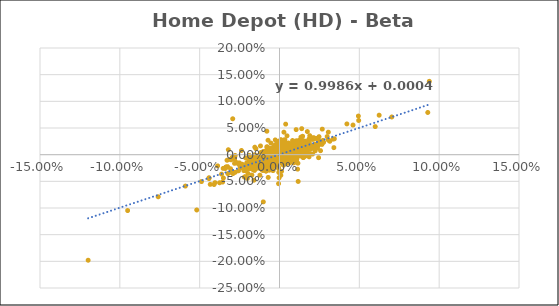
| Category | Series 0 |
|---|---|
| 0.002923183435833865 | 0.017 |
| 0.0002825850883885206 | -0.002 |
| -0.0009726252406339064 | 0.007 |
| -0.0013411865461215866 | 0.002 |
| -0.0007281258848751415 | 0.01 |
| 0.002449095251588762 | 0.002 |
| 0.0004926605689827834 | 0.004 |
| -0.0021835911800677232 | 0.002 |
| 0.0018890363083294837 | 0.013 |
| 0.001647266869345021 | 0.004 |
| -0.002414436638168982 | 0 |
| -0.0003636481179190021 | 0.012 |
| -0.01447441815345063 | -0.009 |
| 0.0012755258980974293 | 0.006 |
| 0.01004374682548792 | -0.004 |
| -0.0004988158193557357 | -0.027 |
| 0.0014201029777529683 | 0.014 |
| -0.015436913265616137 | -0.017 |
| -0.0018353833934839914 | -0.015 |
| 0.0011626229102676966 | 0.012 |
| 0.009940824503679613 | 0.005 |
| -0.003453604674394928 | -0.005 |
| -0.002074434133647607 | -0.006 |
| 0.0016728373042720346 | 0.009 |
| 0.00048709604797259054 | 0.012 |
| 0.0008427977612674997 | -0.004 |
| 0.004615133058087695 | 0.001 |
| 0.005721051924853171 | -0.001 |
| 0.0019824813383773066 | 0.006 |
| -0.007550826754961659 | 0.014 |
| 0.003128750737433128 | 0.024 |
| -0.00017845989113951521 | 0.009 |
| -0.001488783416494277 | 0.011 |
| 0.01083922760346634 | -0.008 |
| 0.003363999180100441 | 0.01 |
| 0.0007570659488558285 | 0.001 |
| -0.0011007176679195263 | -0.004 |
| 0.0018472363580994688 | -0.006 |
| 0.0014558660603223306 | -0.004 |
| 0.0011102812845715793 | -0.001 |
| 0.0006343127281429606 | 0.006 |
| -0.003045960514145296 | 0.003 |
| 0.0006478445173156988 | 0.005 |
| -0.002222026840165925 | 0.007 |
| 7.209632068461147e-05 | 0.001 |
| 0.004085163646849521 | -0.002 |
| 0.0012046078243665992 | 0.009 |
| 0.0037050907149631662 | 0.007 |
| 0.0038739997459671383 | 0.003 |
| 0.002158853672423522 | 0.007 |
| 0.0012467548864110167 | 0.001 |
| 0.005646756562926125 | 0.005 |
| -0.0010736382622734686 | -0.002 |
| -0.001804395664743219 | -0.001 |
| 0.002322446782173193 | -0.003 |
| 0.001803468933287311 | 0.001 |
| -0.0016867300136190755 | -0.004 |
| 0.0008781111202582625 | -0.001 |
| 0.0017507647356032052 | -0.002 |
| 0.0006724949562879612 | -0.005 |
| 0.0007423730932734074 | 0.001 |
| 0.0003279635804251946 | -0.001 |
| 0.005116896296007312 | 0.001 |
| -0.0039724915637947555 | 0.008 |
| 0.0016179463387628878 | 0.008 |
| -0.004663057143858063 | 0 |
| 0.0012709461705413538 | 0.01 |
| 0.008072957350414134 | -0.002 |
| -0.0031924744388955872 | -0.012 |
| 0.0009444852555358096 | 0.003 |
| 0.001592072256781707 | -0.002 |
| 0.00018996960486306058 | -0.016 |
| 0.0030970792875555375 | 0.01 |
| 0.0012713305304810074 | -0.001 |
| -0.00018910668318461443 | -0.003 |
| 0.0014436587098169973 | 0.002 |
| -0.003761977813581785 | -0.005 |
| -0.0008976174447306029 | 0.005 |
| 0.0009836192541532451 | 0.008 |
| -0.002309620711533511 | 0.016 |
| -0.005525675974360822 | -0.015 |
| 0.008196146017733552 | 0.012 |
| -0.0026260422951377427 | 0.001 |
| 0.001275762452255913 | 0.016 |
| 0.006541086075890767 | 0.014 |
| -0.0007502799121211767 | -0.005 |
| 0.002056155374497548 | 0.002 |
| -0.0003842577293442506 | 0.011 |
| 0.00984846737551015 | 0.014 |
| -0.00036923685973555553 | 0.009 |
| 0.008190946928299692 | 0.014 |
| -0.00202449028924534 | 0.003 |
| -0.0010521455442770167 | 0.025 |
| -0.003739429575970621 | -0.011 |
| -0.00011408709408766704 | -0.011 |
| 0.0029323728639507607 | 0.007 |
| 0.005506298872194781 | 0.008 |
| 0.0032019611540636816 | -0.006 |
| 0.0015488780033008354 | -0.002 |
| -0.0004729534441145766 | 0.007 |
| -0.004070826370242253 | -0.005 |
| 0.008974325134520456 | 0.002 |
| 0.005362862086620401 | 0.012 |
| -0.003230291135099761 | 0.007 |
| -0.0008279040973793172 | 0.007 |
| 0.0019856303069889503 | 0.004 |
| -0.0004581739347455649 | 0 |
| -0.0010583824636460903 | 0.012 |
| 0.00079089722066783 | -0.001 |
| 0.0018340279279212002 | -0.002 |
| -0.005183178668968558 | -0.001 |
| 0.008303380074131894 | -0.008 |
| 0.006398818907860759 | 0.005 |
| 0.004028661363921104 | 0.008 |
| 0.007033799683552555 | 0.01 |
| 0.0016623225124401397 | -0.002 |
| 0.0013029031448006378 | 0.006 |
| -0.0011122055472160275 | -0.007 |
| 0.007033618001404562 | 0.015 |
| 0.006749627831013516 | 0.009 |
| -0.0035244630756861017 | -0.001 |
| 0.009415002053003496 | 0.018 |
| -0.001616379310344751 | -0.007 |
| 0.004385228178396927 | 0.015 |
| 0.008066754439027823 | 0.016 |
| 0.002174396481431362 | 0.002 |
| -0.0005600307136341964 | 0.006 |
| 0.0006026346765155566 | -0.004 |
| 0.011841155234656897 | 0.009 |
| -0.006731944014173874 | -0.011 |
| -0.010898781509218525 | -0.015 |
| 0.0004889403811609849 | -0.005 |
| -0.0006480605989779287 | -0.005 |
| -0.021208513171602883 | -0.03 |
| -0.040979244278871785 | -0.056 |
| 0.017440938639606607 | 0.043 |
| -0.0050015954644285765 | 0.001 |
| -0.037536451302551344 | -0.053 |
| 0.014936071290197583 | 0.016 |
| 0.013914603653299107 | 0 |
| 0.0026129518072288693 | -0.002 |
| 0.013402479965752168 | 0.005 |
| 0.0120690869070601 | 0.003 |
| 0.0003734622144111466 | 0.009 |
| -0.005841403693699454 | -0.001 |
| -0.00549652831466807 | -0.02 |
| 0.0009735944886408721 | 0.013 |
| 0.016028343614550522 | 0.016 |
| 0.011756997779638123 | 0.001 |
| -0.012706864297021059 | -0.018 |
| -0.011095806550352139 | -0.015 |
| -0.013324342350110263 | -0.014 |
| 0.005071573420174946 | -0.007 |
| 0.011032048304691067 | 0.018 |
| 0.0026387939462098053 | -0.001 |
| -0.00048384968403136774 | -0.011 |
| 0.00446310693853591 | -0.004 |
| 0.017378795678667736 | 0.024 |
| -0.001273967637633433 | -0.013 |
| -0.00636359063175973 | -0.008 |
| -0.005724493818052956 | -0.005 |
| -0.0007819660444884358 | 0.004 |
| 0.0017034720983646334 | 0.005 |
| -0.014204163502312905 | -0.01 |
| 0.001481798210046792 | 0.006 |
| -0.001843986249236318 | -0.001 |
| -0.02516289137256489 | -0.015 |
| -0.020966906104724736 | -0.02 |
| 0.0271572407717926 | 0.027 |
| -0.017276334844182117 | -0.01 |
| -0.0029166124426820428 | 0 |
| 0.01376967370441462 | 0.02 |
| -0.02233733580221664 | -0.03 |
| 0.01261483879963432 | 0.005 |
| 0.011566486259060316 | 0.021 |
| 0.00686280811739759 | 0.01 |
| -0.02192020549488527 | -0.026 |
| 0.003336571356168383 | -0.011 |
| 0.01672687474169199 | 0.006 |
| -0.005525298565605352 | -0.004 |
| 0.008250731400845313 | 0.003 |
| -0.0028866474724003055 | -0.003 |
| 0.008109023830139561 | 0.009 |
| 0.01066157798822931 | 0.003 |
| 0.0008313657676830566 | 0.028 |
| -0.005726120857699746 | -0.015 |
| -0.008536535555283331 | 0 |
| 5.617682967939963e-05 | 0.004 |
| -0.01338056915166519 | -0.008 |
| 0.0018371189116968 | 0.006 |
| 0.01043418958854292 | 0.047 |
| 0.0011136358523251566 | 0.004 |
| -0.008187541902161422 | -0.009 |
| 0.0025490455240648746 | -0.001 |
| -0.007205815880669042 | 0.007 |
| -0.0022536964035709817 | -0.015 |
| 0.012811201149927953 | 0.01 |
| 0.003457960066380883 | -0.008 |
| -0.0002656559269333947 | 0.008 |
| 0.009682176113057217 | 0.007 |
| 0.009370632999603501 | 0.004 |
| 0.0017076314600799058 | 0.017 |
| 0.0008835217690965624 | 0.004 |
| -0.006842165025108815 | -0.016 |
| 0.004060558004020054 | -0.009 |
| -0.000855843612027285 | -0.006 |
| -0.002632227136203147 | 0.011 |
| 0.007386738519040259 | 0.013 |
| -0.0031357367883761977 | -0.015 |
| 0.003248373977771557 | -0.001 |
| -0.002023202806873625 | 0.003 |
| -0.002357245505469785 | -0.002 |
| -0.011564198388288038 | -0.01 |
| 0.01269582803565994 | 0.017 |
| -0.006879563584568427 | -0.003 |
| 0.01084919435028664 | 0.004 |
| 0.0044795986279628774 | 0.021 |
| 0.0007026178887243884 | 0.003 |
| 0.00856737485448189 | 0.009 |
| -0.0007141955380813858 | 0.013 |
| 0.0031259362467830343 | 0.011 |
| 0.0010687182218256375 | 0.007 |
| 0.0017433501078361058 | 0.008 |
| -0.004026050917702695 | -0.005 |
| 0.002471510972283708 | -0.003 |
| -0.0010170746345898873 | 0.004 |
| -0.0021261593144484836 | 0.001 |
| -0.004023433979269853 | -0.007 |
| 0.0017121614137458607 | -0.001 |
| -0.006345489498865264 | 0.006 |
| 0.0018619806819504259 | -0.014 |
| -0.013724735741665661 | -0.005 |
| 0.0022045806696182613 | 0 |
| -0.008604290761129008 | -0.007 |
| 0.006178624478169192 | 0.001 |
| 0.0007583817752760957 | -0.001 |
| 0.0030680150237090142 | -0.006 |
| -0.00494735413740377 | -0.002 |
| 0.00862075320099387 | 0.004 |
| 0.008481296202235589 | 0 |
| 0.008823039183714743 | 0.008 |
| 0.0034732074550045677 | 0.008 |
| -0.007094178621538827 | -0.003 |
| 0.008749035695488905 | 0.005 |
| 0.0010792305300737493 | 0.004 |
| -0.001028090429120665 | 0.001 |
| 0.00397365665748306 | 0.011 |
| 0.0021604883344306103 | -0.001 |
| -0.003952948196134454 | 0.008 |
| -0.0009484790461010695 | -0.001 |
| 0.00183808439484201 | -0.001 |
| 0.004780938945058377 | -0.001 |
| 0.009101545880016992 | -0.005 |
| -0.003032251490652005 | -0.008 |
| -0.006562253298748155 | -0.011 |
| -0.005754180827438504 | 0.001 |
| 0.00488474987511589 | 0.001 |
| -0.0010403758135703045 | -0.006 |
| 0.004926493587738445 | -0.003 |
| 0.0046441380578801095 | 0 |
| 0.0035382963367192044 | 0 |
| 0.002824165029469361 | 0.007 |
| -0.00026237996116773576 | 0.005 |
| -0.001441718864821362 | 0 |
| -0.0071138709971333425 | -0.009 |
| -0.004005957759204981 | -0.011 |
| 0.00638924424064391 | -0.005 |
| -0.00760221974957398 | 0.005 |
| 0.007919471183698512 | 0.007 |
| 0.0033231362802699227 | 0.001 |
| 0.002427959426412052 | 0.012 |
| 0.0020685672284348477 | 0.012 |
| -0.0003981892866123937 | -0.006 |
| -0.001691231454109654 | 0.006 |
| 0.0061988533346399866 | 0.006 |
| 0.007670392285776817 | 0.003 |
| 0.0002692682118519141 | 0 |
| 0.005701427427593275 | 0.004 |
| -0.004430275493816138 | -0.012 |
| 0.00013443037712890238 | 0.008 |
| -0.001654305329620409 | 0.021 |
| -0.002803170482476691 | -0.005 |
| -0.0036522883057535926 | 0.009 |
| -0.0022133041469051262 | 0.002 |
| 0.001897843770893859 | 0.022 |
| 0.0037398379635260603 | 0.015 |
| 0.00035666178420923345 | -0.009 |
| 0.005282250806529776 | -0.012 |
| 0.00027546501938591206 | -0.002 |
| -0.005569745746958565 | -0.003 |
| 0.005369011354195541 | 0.013 |
| 0.00125330973621951 | 0.003 |
| 0.007840574975498171 | -0.003 |
| -0.00036850635502849727 | 0.006 |
| -0.0035157543341060027 | -0.021 |
| -0.0013050760951849316 | -0.003 |
| -0.00328924803468289 | 0 |
| 0.0027632769780832067 | -0.003 |
| -6.863417982172493e-06 | 0.001 |
| 0.0036410682297065566 | 0.002 |
| -0.00039663679353352244 | -0.014 |
| 0.0007114930065028613 | -0.005 |
| -0.008169515742554312 | -0.024 |
| -0.005527965508803745 | -0.012 |
| -0.00039506925841348295 | 0.01 |
| -0.0014179577940874877 | -0.013 |
| -0.032864175757028824 | -0.01 |
| -0.020573073719881707 | -0.02 |
| 0.014206284338267983 | 0.014 |
| -0.005905035180855278 | -0.007 |
| 0.021495643069809 | 0.013 |
| -0.0002526762327753618 | -0.043 |
| -0.014391946490294405 | -0.026 |
| -0.00036116990154511086 | -0.003 |
| -0.0042994746692295305 | -0.006 |
| -0.00551185102399232 | -0.001 |
| -0.030864490329077787 | -0.009 |
| 0.018625051767629408 | 0.012 |
| -0.01732721755489608 | -0.038 |
| -0.006559621467715271 | 0.006 |
| 0.015666824420255576 | 0.018 |
| 0.010851291456518197 | -0.002 |
| 0.0105577968389301 | 0.026 |
| -0.006316665267828814 | -0.003 |
| 0.005600317290107348 | 0.013 |
| 0.006259335137365651 | -0.001 |
| 0.02120887695294771 | 0.029 |
| -0.0025089822274502183 | 0.004 |
| -0.009198989607493102 | -0.011 |
| -0.019701475363267495 | -0.035 |
| -0.001481905348797996 | -0.002 |
| -0.007567464311691308 | 0.005 |
| 0.010593800664796094 | -0.014 |
| 0.0022232803457622463 | -0.002 |
| -0.016643094431470606 | -0.019 |
| -0.018151208036480848 | -0.026 |
| 0.00304327583661701 | 0.001 |
| -0.006554890129173208 | -0.003 |
| 0.015532409517731827 | 0.006 |
| 0.003261703042884756 | 0.02 |
| 0.02297393528374414 | 0.03 |
| -0.0021976900564546487 | -0.01 |
| 0.00818552393197347 | 0.027 |
| 0.010941355061463431 | 0.008 |
| -0.03236488351007216 | -0.035 |
| -0.0015221883958135285 | 0.004 |
| -0.02332016543333515 | -0.018 |
| 0.001762194844060927 | -0.006 |
| -0.00035636837875119287 | 0.003 |
| 0.005419488922094429 | 0.012 |
| -0.00019991927787654795 | -0.002 |
| -0.019086676677205427 | -0.009 |
| -0.020773476413007863 | -0.025 |
| 8.641209140813899e-05 | 0.012 |
| -0.015395733182517968 | -0.015 |
| -0.015772090500047797 | -0.02 |
| -0.020588306814405377 | -0.022 |
| -0.02711224768478282 | -0.015 |
| 0.049593807154098 | 0.064 |
| 0.008562629168861635 | 0.012 |
| -0.0012415472330372657 | -0.001 |
| 0.008492440882795549 | 0.009 |
| 0.0012685242435728217 | 0.003 |
| -0.02475667621502542 | -0.022 |
| 0.0343356931888279 | 0.03 |
| 0.00701043468644591 | 0.02 |
| 0.009695296290921585 | 0.005 |
| 0.0040980263439003295 | 0.01 |
| 0.004518445159692908 | -0.004 |
| -0.00014634296629478794 | 0.002 |
| -0.005257562801876614 | -0.003 |
| 0.010721711756711327 | -0.013 |
| 0.002221966823736654 | 0.003 |
| 0.007591452926111408 | -0.012 |
| 0.013183052853609212 | 0.027 |
| -0.014157284018107563 | -0.014 |
| 0.0022028941471379238 | -0.001 |
| 0.001375677416909804 | 0.002 |
| 0.0084887201825663 | 0.018 |
| -0.0078468605052614 | -0.003 |
| -0.001456209694195909 | -0.001 |
| 0.015549242424242493 | 0.014 |
| 0.008597377892989533 | 0.007 |
| 0.000898635405495396 | 0.005 |
| 0.006776204217207926 | 0.011 |
| 0.004708481505539597 | 0 |
| -0.002224495014062744 | -0.009 |
| -0.009357119061652264 | -0.004 |
| 0.0006762624489569102 | 0.003 |
| 0.0007090417596054 | -0.009 |
| 0.012890250202966858 | 0.014 |
| 0.003023976857468691 | 0.016 |
| -0.0026516238471793185 | -0.004 |
| 0.010878709851296353 | 0.025 |
| 0.0014987750396311394 | 0 |
| 0.0017771318387196366 | -0.002 |
| -0.003526412180845262 | 0 |
| 0.006411088047050706 | 0.003 |
| 0.0012317960947767492 | -0.013 |
| -0.0007903837831845228 | -0.009 |
| -0.0005440423780378456 | -0.025 |
| -0.0028255466662847617 | 0.008 |
| 0.0068953381050032014 | 0 |
| -0.0038806002090102654 | -0.007 |
| -0.0011314768996100177 | 0.001 |
| -0.0065241159285216455 | 0.002 |
| -0.008125710368218741 | -0.011 |
| -0.0021317385309919112 | -0.007 |
| 0.014666049353461608 | 0.007 |
| 0.0029533287823806376 | 0.009 |
| 0.006949618845646821 | -0.008 |
| -0.0008680432029370966 | 0.003 |
| 0.004984902865607044 | 0.003 |
| 0.0037059607153993035 | 0.007 |
| -0.0001306063665308388 | 0.004 |
| -0.0029443226469249018 | 0.011 |
| 0.010852515552911779 | 0.021 |
| -0.018974527826038257 | -0.006 |
| -0.0008390729493592541 | 0.005 |
| 0.007182778484540853 | -0.002 |
| -0.004644380264399728 | 0 |
| 0.0035895443381801506 | 0.004 |
| 0.006734293751598397 | 0.01 |
| 0.01156858594411525 | 0.02 |
| 1.7438676892522764e-05 | -0.007 |
| 0.0021484075277968806 | 0.022 |
| 0.0020846384074615365 | 0.009 |
| 0.004636398681665099 | 0.008 |
| 0.0010474498226595852 | 0.007 |
| -0.0060674708281390766 | -0.013 |
| 0.0034778681120144483 | -0.007 |
| 3.808587325715429e-05 | 0.01 |
| 0.006609378462220095 | 0.012 |
| -0.0006294261903205811 | 0.005 |
| 0.000509364739569973 | -0.002 |
| -0.002273774879087531 | 0.01 |
| 0.0015790653174507785 | -0.004 |
| 0.001012037741434657 | -0.004 |
| 0.008841219132246891 | 0.006 |
| -0.0021917864252406494 | 0.003 |
| -0.00036894696387390624 | -0.001 |
| 0.004685305365033532 | -0.014 |
| 0.0010714723049920494 | -0.007 |
| 0.0009514004274504551 | 0.008 |
| -0.007502130129708795 | -0.024 |
| -0.0021239991380873624 | 0.011 |
| 0.00963832295922562 | -0.002 |
| -0.004471014787957861 | -0.005 |
| -0.016511677868827124 | -0.024 |
| -0.0016053813214057522 | 0.002 |
| -0.0030214418181440106 | -0.003 |
| 0.0037203210344445292 | 0 |
| -0.024130630943291487 | -0.022 |
| 0.008016017810211773 | 0.007 |
| 0.00583895766667486 | 0.001 |
| 0.008895249319527565 | 0.003 |
| -0.005837319908772343 | 0.001 |
| -0.006749360908960611 | -0.008 |
| 0.008495790833841 | 0.003 |
| -0.002824365652362215 | -0.013 |
| -0.011914139769699683 | 0.016 |
| 0.001353534780883292 | 0.008 |
| -0.008375618352052028 | -0.011 |
| -0.0069119572935958384 | -0.008 |
| 0.0020984398243635294 | 0.006 |
| -0.013195355808466647 | -0.006 |
| -0.0027652013400870645 | -0.001 |
| 0.021432345278653342 | 0.03 |
| 0.008161896642135735 | 0.014 |
| 0.006135555437609463 | 0.002 |
| 0.010497663083042452 | 0.001 |
| 0.0046600819951694294 | 0.004 |
| -0.00034987685027698667 | 0 |
| -0.002037619727485618 | 0.005 |
| 0.004097449858325275 | 0.017 |
| -0.0016115422390061696 | 0.017 |
| 0.0009317695307899942 | 0.006 |
| 0.009717372571954597 | 0.002 |
| 0.002985176934281464 | 0.002 |
| 0.009472195075278522 | 0.016 |
| -0.0012592326804730103 | -0.009 |
| -0.001731933325650914 | -0.019 |
| -0.009496324715228988 | -0.004 |
| -0.0012339839170762978 | 0.008 |
| 0.003823212459416858 | 0.003 |
| 0.005757422425228809 | 0.005 |
| 0.007672277820080398 | 0.011 |
| 0.0029281490252435205 | -0.001 |
| 0.007672358989710748 | 0.009 |
| -0.0018058494836139527 | -0.003 |
| -0.004835457345313876 | 0.007 |
| 0.0012365799156572876 | -0.004 |
| 0.004510627158405667 | -0.006 |
| 0.002285278994477169 | 0.016 |
| 0.004620138604158219 | 0.02 |
| 0.00017585947169163063 | 0.002 |
| -0.0034037753375577573 | -0.007 |
| -0.006531204644412147 | -0.008 |
| 0.0035819355184592006 | -0.005 |
| -0.0061767347442999165 | -0.007 |
| 0.0028287212634507952 | -0.008 |
| 0.006847502370160408 | 0.009 |
| 0.00468811866363672 | 0.008 |
| -0.00526235610486292 | 0.004 |
| 0.007387629133693174 | 0.006 |
| -0.00161606948107329 | 0.005 |
| -0.002578641959370631 | -0.003 |
| -0.010885509660889747 | -0.017 |
| -0.008998852495319398 | -0.004 |
| -0.0072827367651240316 | -0.003 |
| -0.02977780051499812 | -0.034 |
| 0.013017006826634425 | 0.019 |
| 0.0007668897934256513 | -0.004 |
| 0.01876226603513209 | 0.018 |
| -0.006616543400644659 | -0.007 |
| -0.011957583129186489 | -0.014 |
| 0.014762028608582556 | 0.006 |
| -0.02929276360753441 | -0.032 |
| 0.002464268112370549 | 0.001 |
| 0.014426183452732166 | 0.009 |
| 0.012105875347909967 | 0.021 |
| -0.007914764079147596 | 0.044 |
| 0.008246825558263726 | 0.015 |
| -0.0005060815269983809 | 0.003 |
| -0.025946389777450785 | -0.016 |
| 0.010983067039910699 | 0.005 |
| -0.0032031906836484936 | -0.002 |
| 0.006545469754213773 | 0.017 |
| 0.012687244194824032 | 0.024 |
| 0.0006428273461489553 | 0.003 |
| -0.006899120439028739 | -0.017 |
| 0.010842075925499017 | 0.006 |
| 0.013009823744460025 | 0.018 |
| 0.0009106182795699524 | 0.013 |
| -9.400042300200528e-05 | 0.008 |
| 0.00032231746255573235 | 0.001 |
| 0.0072296678179091245 | -0.001 |
| 0.0028791074766822966 | 0.005 |
| -0.0007243559711188619 | 0.001 |
| -0.0031356092824674775 | -0.013 |
| 0.002581755593803692 | -0.003 |
| 0.0003426822370828919 | 0.003 |
| 1.9955233758972568e-05 | -0.012 |
| -0.004895586322955614 | -0.015 |
| -9.69228661094057e-05 | 0.007 |
| -0.00841639425358831 | -0.004 |
| 0.006158565361019441 | 0.012 |
| -0.0024289165022262083 | 0.007 |
| -0.005316326462073695 | 0 |
| 0.005047623227845355 | 0.009 |
| -0.012258376613342059 | -0.004 |
| -0.01790323952044892 | -0.024 |
| 0.007971990677411389 | 0.006 |
| 0.014216853396000317 | 0.005 |
| -0.004478304612789308 | -0.005 |
| -0.015560826054260457 | 0 |
| 0.009104546742895181 | 0.01 |
| 0.00641570185654583 | 0.012 |
| 0.010938930544257763 | 0.013 |
| -0.001387079289088211 | -0.002 |
| 0.009955666436289423 | 0.006 |
| -0.0019995460129251796 | 0.001 |
| 0.002762828253096483 | 0.004 |
| -0.003919344885671916 | 0.005 |
| 0.006871609403255041 | -0.005 |
| -0.0035686728395061262 | 0.002 |
| 0.002847139009142241 | -0.011 |
| 0.001920439870594981 | -0.003 |
| 0.004072697314876805 | 0.002 |
| 0.00558137996062924 | 0.01 |
| -0.0008323956544341593 | -0.011 |
| 0.0032533282404039188 | 0.009 |
| -0.0030228734036372717 | -0.007 |
| 0.009662360578885698 | 0.012 |
| 0.00370405391746087 | -0.01 |
| -0.001185730946278274 | -0.012 |
| 0.0007025258405917167 | 0.008 |
| 0.0027301269509030224 | -0.005 |
| 0.002560628553277322 | 0 |
| -0.001962445200253349 | -0.004 |
| 0.001564620781921544 | 0.006 |
| 0.0007115504036430131 | 0.007 |
| 0.0008370932502488326 | 0.007 |
| 0.007695462486638771 | 0.003 |
| 0.0005031309486422941 | 0.007 |
| -0.000592563172038818 | -0.054 |
| -0.0037561935529359936 | -0.022 |
| -0.0015827773238195064 | -0.011 |
| 0.0021749357185665286 | -0.002 |
| 0.007507338543994324 | 0.002 |
| 0.0021955297992111156 | 0.011 |
| 0.00417446792250975 | 0.01 |
| -0.004011250527170329 | -0.011 |
| -0.008631064190157245 | -0.013 |
| -0.006638042050567283 | -0.017 |
| 0.006323548428811776 | 0.007 |
| 0.001500276282141666 | -0.005 |
| 0.009135730393304842 | 0.006 |
| -0.00316283682622831 | 0.011 |
| -0.0010969527672547441 | -0.003 |
| 0.0029082017034209873 | -0.018 |
| 0.008575166394515055 | 0 |
| 7.258794976916505e-05 | 0.01 |
| 0.007147816208028068 | 0.007 |
| 0.00033527080167328194 | 0.01 |
| -0.000432260408705365 | 0.001 |
| 0.004459221469443442 | 0.01 |
| 0.0049448269622538454 | 0.004 |
| 0.0008661314657181229 | -0.009 |
| -0.0001954088231737039 | 0.007 |
| 0.005128157399996169 | 0.001 |
| 3.395156038288327e-05 | -0.004 |
| -0.005780828513404224 | -0.012 |
| 0.002946024729223451 | 0.005 |
| 0.008378781594537532 | 0.006 |
| -0.007059870773669763 | -0.003 |
| 0.0035333941295578875 | 0.005 |
| -0.0028032085956850583 | -0.007 |
| 0.0049024150649641385 | 0.015 |
| 0.006655292725288531 | 0.015 |
| -0.0028552233792408233 | -0.004 |
| 0.006976281256220629 | -0.004 |
| -0.0015145386587512855 | -0.002 |
| 0.001870155186330269 | 0.008 |
| 0.00836654718799501 | 0.019 |
| 0.003862144651035182 | 0.014 |
| -0.002651954277064661 | 0.004 |
| 0.0002890878375325645 | 0 |
| 0.0011409648528637462 | 0.003 |
| -0.009042140524546438 | -0.007 |
| -0.015730684849202037 | -0.003 |
| 0.010053551114029613 | 0.012 |
| -0.0008668473616095795 | 0.001 |
| 0.003134355715769477 | -0.005 |
| -0.017705852615678808 | -0.02 |
| 0.0072546442124061805 | 0.015 |
| 0.014980362705145023 | 0.015 |
| 0.011250640619361318 | 0.013 |
| 0.0033256464618900416 | 0.003 |
| -0.005400833288500828 | -0.006 |
| 0.007326359568592178 | 0.014 |
| 0.0016884988171557147 | 0.004 |
| 0.0064626610081155444 | 0 |
| -0.0016304428235363044 | 0.003 |
| 0.0018435419717006685 | 0.011 |
| -0.0029199801192842934 | -0.004 |
| 0.004705826501577137 | -0.001 |
| -0.0038155427255142094 | 0.014 |
| -0.010518108756295885 | -0.007 |
| -0.0335135944873044 | -0.023 |
| -0.030280015747592093 | -0.01 |
| -0.003778518705585654 | -0.009 |
| -0.044163278665378725 | -0.045 |
| -0.008238327357692588 | -0.031 |
| 0.04603922524388837 | 0.056 |
| -0.028107940185681968 | -0.009 |
| 0.042202592421180185 | 0.058 |
| -0.03392202215889484 | -0.026 |
| -0.017053909799797706 | -0.027 |
| -0.07596968075979771 | -0.079 |
| 0.04939633578003022 | 0.072 |
| -0.048868410917935035 | -0.05 |
| -0.09511268047479748 | -0.105 |
| 0.0928711945304439 | 0.079 |
| -0.11984050283657066 | -0.198 |
| 0.05995482224354909 | 0.053 |
| -0.05183082330706679 | -0.104 |
| 0.004707893749218206 | 0.035 |
| -0.043359522534749395 | -0.056 |
| -0.02929385835517062 | 0.067 |
| 0.09382765710199337 | 0.138 |
| 0.011535019797084933 | -0.016 |
| 0.06241416083633622 | 0.074 |
| -0.0336873163071707 | -0.024 |
| 0.03351603599491648 | 0.029 |
| -0.0160127919593398 | -0.048 |
| -0.04414239782712159 | -0.043 |
| 0.022829386763812964 | 0.015 |
| -0.015137124539950086 | -0.014 |
| 0.07033130412070787 | 0.071 |
| -0.0016030454108602044 | 0.005 |
| 0.03405642604938697 | 0.013 |
| 0.01448737809002254 | 0.034 |
| -0.010104594561656355 | -0.014 |
| 0.030572524197665762 | 0.042 |
| -0.022030456139364496 | -0.042 |
| 0.005816710738100639 | 0.007 |
| 0.026793591827257934 | 0.048 |
| -0.017880997439608137 | -0.016 |
| -0.030674846625766805 | -0.026 |
| 0.02293024819481393 | 0.018 |
| -0.000539418642451106 | -0.009 |
| 0.01391807849024218 | 0.049 |
| 0.014714073196697708 | 0.026 |
| -0.005242350129234907 | -0.001 |
| 0.026583874358714787 | 0.019 |
| -0.009212419757034462 | -0.009 |
| -0.028059043479156554 | -0.006 |
| 0.004249817183674676 | 0.015 |
| 0.009040573531170715 | 0.017 |
| -0.006979403438802989 | -0.007 |
| 0.011504623615899323 | 0.025 |
| 0.016871501011734846 | 0.022 |
| 0.0001774865178509888 | 0.009 |
| -0.02054383139042848 | -0.015 |
| -0.017462684487059787 | -0.012 |
| 0.01152482269503552 | 0.019 |
| 0.003926380368098004 | 0.021 |
| 0.03150120473513285 | 0.025 |
| -0.010484408800538914 | -0.03 |
| 0.01665104312780974 | 0 |
| -0.007773563825670182 | 0.011 |
| 0.002353731206609311 | 0.004 |
| 0.012289160703107926 | 0.002 |
| 0.014827343010993532 | 0.02 |
| -0.0021079466294262605 | -0.009 |
| 0.004812310007822562 | 0.014 |
| 0.0037512605483673855 | -0.005 |
| 0.00821080396500995 | 0.022 |
| 0.013648963587616247 | -0.001 |
| -0.0033686961032639573 | -0.008 |
| 0.02621170498176606 | 0.024 |
| 0.012041591393674889 | 0.007 |
| -0.007799182648133396 | 0 |
| -0.0053130787794885 | -0.009 |
| -0.058944121574601716 | -0.059 |
| 0.013060857399820103 | 0.012 |
| 0.008312207568449193 | -0.004 |
| 0.018962430582503575 | 0.036 |
| -0.0036002995449221364 | 0.004 |
| 0.000594188515139038 | -0.007 |
| -0.005649463621948292 | -0.01 |
| 0.006495057687217143 | 0.01 |
| 0.004307441642665166 | 0.005 |
| -0.025855158736495243 | -0.017 |
| 0.01095946995898811 | -0.003 |
| -0.024226917788673585 | -0.018 |
| 0.01468569814393228 | 0.021 |
| 0.015409859690034278 | 0.018 |
| 0.005022110834792981 | -0.009 |
| 0.004541282342595654 | 0.001 |
| 0.0158817383970018 | 0.004 |
| -0.010818562640735552 | -0.009 |
| 0.007827502448081614 | 0.007 |
| -0.005643639942711776 | -0.005 |
| 0.01046620453355751 | 0.009 |
| -0.009362519779971379 | -0.002 |
| 0.013406355182839835 | 0.033 |
| 0.00908203857989931 | 0 |
| -0.0034061043340275488 | 0.001 |
| 0.00284863958800452 | 0.009 |
| 0.008406905384326757 | -0.001 |
| 0.0016790493997245193 | 0.009 |
| 0.005747091149111094 | 0.01 |
| -0.012319827107282633 | -0.005 |
| -0.0061903908321639944 | 0.006 |
| 0.007395129414764723 | 0.008 |
| -0.006473401020556158 | -0.008 |
| 0.012428381451883519 | -0.002 |
| -0.0037502608610255894 | 0.006 |
| 0.007670459796317086 | -0.003 |
| 0.007181026681992719 | 0.003 |
| 0.0036119601409574376 | 0.006 |
| 0.0064297401187354275 | -0.001 |
| 0.006427727877827971 | 0.007 |
| 0.0006329945419150107 | 0.008 |
| 0.0027422358024395965 | 0.011 |
| -0.007969123366671882 | 0.001 |
| 0.013996502374245878 | 0.024 |
| -0.0020471252976762555 | 0 |
| -0.00017193183199293305 | -0.004 |
| 0.0027098744385312123 | 0.027 |
| 0.0023033775972136628 | -0.011 |
| -0.004404415625792857 | -0.008 |
| 0.0031586589033587575 | -0.008 |
| 0.0034411358997610275 | 0.009 |
| 0.01004368354743379 | 0.012 |
| 0.003596325569466652 | -0.002 |
| 0.010195666188487662 | 0.02 |
| 0.0016730243508407128 | -0.011 |
| 0.006732576659826961 | -0.008 |
| -0.0021949766391772263 | -0.004 |
| 0.00752504778148233 | 0.003 |
| 0.015365857116526938 | 0.01 |
| -0.03512583639592948 | -0.044 |
| -0.008132999137496877 | -0.018 |
| -0.027756378831384043 | -0.001 |
| 0.020145024971186976 | 0.029 |
| -0.017584790641843373 | -0.016 |
| 0.0005330634075928486 | 0.013 |
| 0.01274180851668838 | 0.016 |
| 0.005219385613883576 | 0.018 |
| -0.004618958014818264 | -0.014 |
| -0.00841237162124231 | -0.006 |
| -0.01118257020384228 | -0.017 |
| -0.011571124305988612 | -0.01 |
| 0.010517942372282096 | 0.004 |
| -0.02372141140135786 | -0.025 |
| 0.002987407782707008 | -0.003 |
| 0.015976763311659203 | 0.011 |
| 0.016110548559024496 | 0.014 |
| -0.004812626805108078 | -0.001 |
| 0.008253709372292528 | 0.021 |
| 0.005292893250074426 | 0 |
| -0.009571699006152401 | 0.006 |
| 0.01797553487594228 | 0.01 |
| -0.013988024514247743 | -0.02 |
| 0.01740579300495404 | 0.023 |
| 0.008007135650470065 | 0.006 |
| 0.008790685934612519 | 0.005 |
| 0.016418713134107588 | 0.003 |
| -0.006306907889152336 | 0.012 |
| -0.006623138843883547 | -0.011 |
| -0.0015278028589691406 | 0.002 |
| 0.00013492797142955482 | 0 |
| -0.016329822808936134 | -0.014 |
| 0.0047272769717412455 | 0.008 |
| -0.002195682985199454 | -0.005 |
| 0.005218945382994278 | -0.012 |
| 0.0034457896215134287 | 0.007 |
| -0.01858953826264864 | -0.025 |
| -0.0030256074002417144 | 0.003 |
| -0.03528790685054317 | -0.026 |
| 0.011947307117329942 | 0 |
| -0.012129506270184387 | -0.011 |
| 0.01231819349472163 | 0.015 |
| 0.017799313644932147 | 0.024 |
| 0.022047038430944355 | 0.019 |
| 0.019460190971818836 | 0.011 |
| -0.00028771240154390476 | -0.006 |
| 0.011699872344305584 | -0.05 |
| -0.001399802844669673 | 0.021 |
| 0.007651888434169196 | 0.008 |
| -0.009978559392721298 | -0.005 |
| 0.013610365817456005 | 0.003 |
| 0.011648048198820149 | 0.009 |
| -0.004791957892531062 | -0.025 |
| -0.01156383241031389 | -0.01 |
| 0.003946420613320845 | 0.004 |
| -0.0067925413261787915 | -0.004 |
| 0.00563591695385024 | 0.006 |
| 0.016161717804443754 | 0.007 |
| -0.0015844155129681736 | 0.002 |
| 0.0023969253233782073 | 0.007 |
| -0.0045954897137437944 | 0.005 |
| 0.011271167954760575 | -0.003 |
| 0.0017911507324332998 | -0.015 |
| -0.0006241465681479097 | -0.011 |
| 0.008836235109307422 | -0.015 |
| -0.0019355954929820562 | -0.005 |
| 0.002787137455443789 | -0.004 |
| -0.007949220068876994 | 0.015 |
| -0.0012851160688518437 | -0.003 |
| -0.001264960061067022 | -0.001 |
| -0.004359266922526861 | 0.004 |
| 0.012921214314501217 | 0.009 |
| 0.0017728480872187813 | 0.006 |
| 0.005757638800703457 | 0.016 |
| -0.0035111001267972286 | -0.013 |
| -0.003906281591951277 | 0.002 |
| -0.0020731166033364223 | -0.004 |
| 0.0007458112528002658 | -0.001 |
| 0.0035365757816374632 | 0.004 |
| 0.008722515973276224 | -0.006 |
| -0.0022273622890431888 | -0.011 |
| 0.0013415471795312772 | -0.003 |
| 0.00643883774021714 | 0.001 |
| -0.01475478359029514 | -0.006 |
| 0.007082539553862066 | 0.008 |
| 0.005709900559720538 | 0.006 |
| 0.01484736429268918 | -0.005 |
| 0.005491890982414871 | 0.011 |
| -0.006554796741165214 | 0.008 |
| 0.0004158321511944507 | 0.019 |
| 0.0022756031663768717 | -0.008 |
| -0.003753438464607517 | -0.021 |
| -0.00719001775768402 | 0.027 |
| 0.008136402839514334 | -0.009 |
| 0.013935576257400273 | 0.004 |
| 0.0003167309215053038 | 0.017 |
| -0.0030105863636010755 | 0.018 |
| 0.003615803325289546 | 0.004 |
| -0.0014888363213811928 | -0.009 |
| -0.025677859113367063 | -0.03 |
| 0.009760662477304782 | 0.015 |
| -0.019311502938707092 | -0.026 |
| 0.01605173602136656 | -0.003 |
| 0.013898236818535858 | 0.008 |
| 0.001008804827627774 | 0.007 |
| 0.01085330416143404 | 0.017 |
| 0.003897472454245321 | 0 |
| 0.007399345996609075 | 0.004 |
| -0.0011134975827398197 | -0.012 |
| -0.0003451599624669788 | 0.007 |
| 0.0016624551137118804 | -0.006 |
| 0.004710983101741784 | 0.002 |
| -0.0005692749114954987 | -0.008 |
| -0.0003203995331321208 | 0.02 |
| -0.004415808390544673 | 0.008 |
| -0.0018548941356217874 | -0.012 |
| -0.007732849379657014 | -0.014 |
| 0.0012562878885591378 | -0.031 |
| 0.01135166191319037 | -0.027 |
| -0.024478846903396523 | -0.018 |
| -0.004750165824920272 | 0.012 |
| 0.023790719336683086 | 0.013 |
| -0.008080844323930969 | -0.005 |
| -0.01306620434127681 | -0.011 |
| -0.013417213827191521 | -0.025 |
| 0.019495975820425837 | 0.01 |
| -0.005359271617984662 | 0.022 |
| 0.014154683554241432 | 0.023 |
| 0.006030283013025661 | 0.011 |
| 0.010395479646353678 | 0.01 |
| 0.0010153985185334946 | 0.016 |
| 0.006491958593476621 | 0.02 |
| -0.0015696886322292825 | 0.013 |
| 0.0028793426720601367 | -0.007 |
| -0.014760500437832724 | 0.011 |
| -0.0006027388863633076 | 0.021 |
| 0.0070251207482558975 | -0.001 |
| -0.0076308370066411335 | 0.004 |
| -0.005467303581109473 | 0.01 |
| 0.00524023305923671 | 0.015 |
| 0.016631197691788335 | 0.022 |
| -0.0008680249789911887 | -0.005 |
| -0.003157823166939022 | 0.009 |
| 0.003622538555784205 | 0.001 |
| 0.011825144919693331 | 0.008 |
| 0.014438277854756487 | 0.025 |
| -0.0009735379152555623 | -0.005 |
| 0.0014752303666720756 | -0.004 |
| 0.004220639958823158 | 0.006 |
| 0.007719962803593772 | 0.015 |
| -0.000196182910288778 | 0.005 |
| 0.00329458162447116 | -0.001 |
| -0.0040878020277237415 | -0.001 |
| 0.011094247768300924 | 0.008 |
| 0.0036087492386858155 | 0.017 |
| -0.005306453038726788 | -0.004 |
| -0.006802361610853236 | -0.009 |
| 0.009306060063749566 | 0.006 |
| -0.009210671343885979 | -0.014 |
| 0.010928710658818286 | 0.008 |
| 0.001782224167916624 | -0.012 |
| -0.0002149192142553158 | 0.002 |
| -0.0008455306301830001 | -0.003 |
| 0.006762797680233579 | 0.018 |
| -0.007194637501869883 | -0.005 |
| 0.0027480346410215795 | 0.02 |
| -0.006678337857112138 | 0.008 |
| 0.0007035388242977447 | -0.002 |
| 0.008165390549454088 | 0.017 |
| 0.007373346471123199 | 0.005 |
| -0.010435666020885526 | 0.006 |
| -0.008673894514173552 | -0.031 |
| -0.021449387057151936 | -0.041 |
| 0.012173151138064053 | 0.027 |
| 0.014917933130699224 | -0.006 |
| -0.0025300382141189015 | -0.011 |
| -0.008517302421882755 | -0.01 |
| -0.0029434351705374118 | -0.007 |
| 0.010554756443649449 | 0.005 |
| -0.0007838196541576359 | 0 |
| 0.009911305963146155 | -0.003 |
| -0.002125302295660103 | 0.006 |
| 0.001876732575158746 | 0.002 |
| 0.0011653983922745859 | 0.005 |
| 0.0007688865190149663 | 0 |
| -0.0004923753184382651 | -0.008 |
| 0.0014469162597214869 | -0.005 |
| -0.003628698801364849 | -0.006 |
| 0.00883408659980689 | -0.001 |
| -0.0007967110255822085 | -0.003 |
| 0.00017508493985585183 | 0.003 |
| -0.0018238764589828538 | -0.011 |
| 0.004652154850635748 | 0.003 |
| 0.0019484900381676606 | 0.008 |
| 0.0018152110447704484 | -0.005 |
| -0.0020116799642784233 | -0.009 |
| -0.005390207201542929 | -0.012 |
| -0.0004356370007340127 | 0.001 |
| -0.013124547000611053 | -0.002 |
| 0.01400232812106239 | 0.016 |
| 0.005124515064653945 | 0.017 |
| -0.0010832603310065858 | -0.003 |
| 0.005811157422250579 | 0.001 |
| 0.003330606657931945 | 0.006 |
| 0.0023150419323942906 | 0.002 |
| 0.00027734984069871516 | 0.013 |
| 0.001328114078009257 | 0.002 |
| 0.005221640488656032 | 0.008 |
| 0.0075001041681135305 | 0.004 |
| -0.002021900862524517 | -0.011 |
| 0.003359011313352811 | 0.013 |
| -0.00856101125941644 | -0.015 |
| 0.01127795187024705 | 0.011 |
| 0.0034511562975592103 | -0.001 |
| -0.003516830382495284 | -0.015 |
| 0.0011649703264435818 | 0.007 |
| -0.0032622362435132946 | 0.011 |
| -0.007538938952254881 | -0.004 |
| -0.015869531055010655 | -0.008 |
| 0.01516265155019747 | 0.02 |
| 0.008241847210077813 | 0.003 |
| 0.0020166609692362503 | 0.001 |
| 0.010145438559535647 | 0.019 |
| 0.002382253008416102 | -0.005 |
| -0.004712479931257563 | -0.012 |
| -0.00018630181803303003 | -0.005 |
| 0.004206206369982368 | 0.006 |
| -0.005406016994218166 | 0.002 |
| -0.0018428943907755624 | -0.003 |
| 0.008203484714484954 | 0.014 |
| -0.00463244520307915 | -0.005 |
| 0.006005460335342772 | 0.008 |
| 0.0016752839177258672 | -0.01 |
| -0.000939925887858073 | -0.003 |
| 0.000992701388653705 | 0.008 |
| 0.0024680227644109376 | 0.017 |
| 0.002952087595835984 | -0.009 |
| 0.0016073241975147479 | -0.008 |
| 0.0026208594449417255 | 0.011 |
| -0.0070607249129965854 | -0.043 |
| -0.010748457761550978 | 0.002 |
| 0.0012567410636163956 | 0.004 |
| 0.008141540696354754 | 0.02 |
| 0.008523820995256282 | -0.005 |
| 0.0014956926284677152 | -0.009 |
| 0.0022201269217136943 | -0.003 |
| -0.005824931775569864 | -0.007 |
| 0.008807606263982137 | 0.006 |
| 0.00430658828173347 | 0.012 |
| -0.001349146239944865 | -0.003 |
| 0.0003117620525883158 | -0.003 |
| 0.0028425606033477546 | 0.013 |
| -0.000335026835208585 | 0.008 |
| -0.003395488410139813 | -0.004 |
| -0.0013185753191903293 | 0.008 |
| -0.004605599824548556 | 0.001 |
| -0.0077226435922087555 | 0.001 |
| 0.0022765095613401787 | 0.011 |
| -0.00574659914561837 | -0.007 |
| 0.008473908688851006 | 0.001 |
| -0.0015510969268194286 | 0.009 |
| -0.009110924839340617 | -0.002 |
| -0.016977254629493954 | -0.013 |
| -0.0008123495489623656 | 0.009 |
| 0.009519566210937302 | 0.005 |
| 0.012134751708511082 | 0 |
| 0.0014610090402744635 | 0.005 |
| -0.0027763563072890074 | 0.012 |
| -0.020364114325326033 | -0.022 |
| 0.001569166228234442 | 0.009 |
| -0.011909731939276913 | -0.026 |
| 0.011491477734391298 | 0.005 |
| -0.012985880322420762 | -0.01 |
| 0.010524455523362564 | 0.009 |
| 0.004102887438675262 | 0.003 |
| 0.00829828923697451 | 0.022 |
| -0.0019137407494954628 | -0.009 |
| -0.0068657858421348195 | 0.008 |
| -0.0024167715692277048 | 0.002 |
| 0.003022536862308023 | 0.001 |
| 0.01706311013337003 | 0.017 |
| 0.0074601307719690535 | 0.018 |
| 0.0033748045900920953 | 0.013 |
| 0.00739335690054066 | 0.008 |
| 0.0036640167447334893 | 0.001 |
| 0.002995906256131331 | 0.018 |
| -0.0010725793335062406 | 0.004 |
| 0.004748179277871856 | 0.014 |
| 0.0018197824144636776 | -0.006 |
| -0.005051597996847845 | 0.008 |
| 0.009829337739032606 | -0.002 |
| 0.0019493431844783693 | 0 |
| 0.0018000686154020507 | -0.014 |
| 0.0036803672564356127 | 0.002 |
| 0.00646129593037692 | 0.005 |
| 0.004181891914508462 | 0.009 |
| 0.0037328581257503046 | -0.01 |
| 0.0008877005575269603 | 0.001 |
| -0.0034987345002870374 | 0.006 |
| -0.008225815057894437 | -0.006 |
| 0.0005509274303756584 | -0.003 |
| 0.007222639253044116 | 0.014 |
| -1.0677258507119092e-05 | -0.004 |
| 0.003865208849406221 | 0.057 |
| -0.0026016294752068125 | 0.006 |
| 0.00338475516511072 | 0.028 |
| -0.0013986489646171663 | 0.007 |
| -0.0031971323723489764 | 0 |
| 0.0016570786727996278 | -0.001 |
| 0.002293900697124096 | 0.009 |
| -0.02272485568312821 | -0.023 |
| 0.013200221128189193 | 0.01 |
| -0.01896130621854386 | -0.015 |
| -0.011815195971097037 | 0.004 |
| 0.014194423271231882 | 0.018 |
| -0.00844858097922263 | 0 |
| 0.011730928977641941 | 0.019 |
| 0.020707063007576743 | 0.001 |
| 0.0030852936469836223 | -0.012 |
| -0.007181129964413446 | 0 |
| 0.00954911139915815 | 0.01 |
| -0.009136209099282255 | -0.024 |
| -0.007470598440341258 | -0.008 |
| 0.016348409288555077 | 0.014 |
| -0.00874337823922211 | -0.02 |
| -0.010287726483131143 | -0.029 |
| -0.011388032826621375 | 0.004 |
| 0.017777943178882483 | 0.003 |
| 0.010180180373954517 | 0.013 |
| 0.006223704157936716 | 0.004 |
| 0.01383895602639984 | 0.018 |
| -0.0010101874482121298 | 0.005 |
| 0.0014019033292591576 | 0.011 |
| -0.002989739331450192 | -0.002 |
| -0.0026262207741385435 | 0.012 |
| 0.00637407735335227 | -0.015 |
| -0.000629617892823231 | 0.01 |
| -0.01939276609770646 | -0.014 |
| -0.0009637108612128298 | -0.004 |
| -0.0040502124125595396 | -0.03 |
| -0.0014410854751839564 | -0.016 |
| 0.009160030747555226 | -0.002 |
| 0.002817696321081753 | 0.007 |
| -0.014243549462058636 | -0.006 |
| 0.0008199131578892072 | -0.039 |
| -0.0183878958147915 | -0.014 |
| -0.009689520243122751 | -0.019 |
| -0.01103742532143781 | -0.028 |
| -0.01891481307149878 | -0.001 |
| 0.0027717522294530283 | 0.042 |
| -0.012171976789799865 | -0.013 |
| -0.0014966314315554285 | -0.005 |
| -0.005383994684971971 | -0.002 |
| 0.024347568825681787 | 0.028 |
| 0.018886018254227865 | 0.001 |
| 0.006862951356977565 | 0.005 |
| 0.009422549895085064 | 0.014 |
| -0.024391094221877574 | -0.024 |
| 0.005156964694110977 | -0.014 |
| -0.003701786234065696 | -0.006 |
| 0.008401224834796661 | 0.011 |
| 0.014517177775713597 | 0.008 |
| -0.018115705073705524 | -0.025 |
| -0.0189694676826343 | -0.014 |
| -0.0038405482229827426 | 0.004 |
| 0.015766743077059386 | 0.005 |
| 0.0008812208263346832 | -0.009 |
| -0.021173137043269175 | -0.006 |
| -0.007166241273349194 | -0.003 |
| -0.010142864698185927 | -0.089 |
| -0.018412176288573612 | -0.024 |
| 0.014956809844988816 | 0.016 |
| 0.022372746986266234 | 0.011 |
| -0.002442612295166069 | -0.003 |
| -0.015473463284818578 | 0.014 |
| 0.018642627244987553 | 0.022 |
| -0.005254711002293466 | -0.009 |
| -0.00793401612012401 | 0 |
| -0.02951809594651711 | -0.005 |
| -0.007233836932796112 | -0.019 |
| 0.025698324022346508 | 0.007 |
| -0.0042918454935622075 | 0.002 |
| -0.012961554353542182 | -0.004 |
| -0.00742095611408311 | 0.005 |
| 0.021408493905025416 | 0.032 |
| 0.022383840279651235 | 0.007 |
| 0.012347803738532281 | 0.016 |
| 0.011662250349640857 | 0.013 |
| -0.00043467350194470455 | -0.033 |
| 0.011304184094790948 | 0.001 |
| -0.012272780670315009 | -0.038 |
| 0.014343931206577842 | -0.004 |
| 0.005066192347173759 | -0.016 |
| 0.007144963967017803 | 0.012 |
| 0.012256530405287291 | 0.011 |
| -0.006293721392175655 | -0.029 |
| -0.015652532890091164 | -0.03 |
| 0.0034102873691344016 | 0.009 |
| 0.0080908782936564 | 0.012 |
| -0.012551716914267819 | -0.002 |
| -0.009716869386889204 | -0.021 |
| 0.004253372460194527 | 0.014 |
| -0.0026509873983658894 | 0.028 |
| -0.01687728929567678 | -0.014 |
| -0.003417540503973915 | -0.001 |
| 0.011174658040455254 | 0.013 |
| -0.012144137417661627 | -0.019 |
| -0.000204890508788802 | -0.014 |
| 0.016057599693967584 | 0.025 |
| -0.0006185275905885579 | 0.024 |
| -0.01475294038502506 | -0.015 |
| -0.02773997077607282 | -0.033 |
| 0.005697858972138148 | 0.016 |
| -0.02814632738377887 | -0.016 |
| 0.002098103084882119 | 0.005 |
| 0.02474689050564538 | 0.034 |
| -0.03628454810495618 | -0.036 |
| 0.005675313957399952 | 0.022 |
| 0.004837102743912469 | -0.007 |
| 0.0298624349775356 | 0.034 |
| -0.03564975338184306 | -0.051 |
| -0.005674159064547379 | -0.016 |
| -0.032037134944001844 | 0.009 |
| 0.00245788276325154 | -0.02 |
| -0.016463178415666024 | -0.028 |
| -0.0012960017076728558 | 0.024 |
| 0.02386974310955492 | 0.022 |
| -0.003946429947140562 | 0 |
| 0.020169610355263545 | 0.017 |
| -0.04039522115020122 | -0.052 |
| -0.005833809077192775 | 0.009 |
| 0.00014612424662696633 | -0.002 |
| 0.01855506797629536 | -0.004 |
| -0.008120792702107527 | 0.007 |
| 0.009450764687376267 | 0.02 |
| 0.01988322907058282 | 0.031 |
| 0.024742227391912897 | 0.019 |
| -0.006274289122320975 | -0.019 |
| -0.007482787410912017 | -0.012 |
| 0.018431056049039052 | 0.029 |
| -0.016347364741597592 | -0.003 |
| 0.0031373675320187644 | -0.004 |
| 0.009523393579413009 | -0.007 |
| -0.010793908688002896 | -0.014 |
| -0.023798705952956634 | 0.008 |
| -0.02911031355312088 | -0.035 |
| -0.03876837415339185 | -0.021 |
| -0.0037737056722930706 | -0.016 |
| 0.014592502168395916 | 0.004 |
| -0.032511959134456814 | -0.022 |
| 0.0022008470670371594 | -0.01 |
| 0.02447725615264873 | -0.006 |
| -0.0013015334188627437 | -0.001 |
| 0.009532193760987795 | 0.024 |
| 0.03056329085577736 | 0.028 |
| -0.002973101484249896 | -0.001 |
| -0.02014302160708281 | -0.044 |
| -0.000711753084481459 | 0.014 |
| -0.008759227302603145 | 0.001 |
| 0.010553762105785847 | 0.018 |
| 0.0015841770513915776 | 0.017 |
| 0.0035731157621645693 | -0.001 |
| 0.014964578110208349 | 0.011 |
| -0.0008302114989416909 | -0.001 |
| -0.011527473598367033 | 0 |
| -0.009243908956706903 | -0.004 |
| -0.004456897454697795 | 0.007 |
| -0.00299859539478875 | 0.008 |
| 0.019201241036518768 | 0.01 |
| -0.008363619420370894 | 0.002 |
| 0.027628333137554417 | 0.023 |
| 0.005895816028186118 | 0.008 |
| 0.009861360135356989 | 0.009 |
| -0.009332449768064022 | 0.005 |